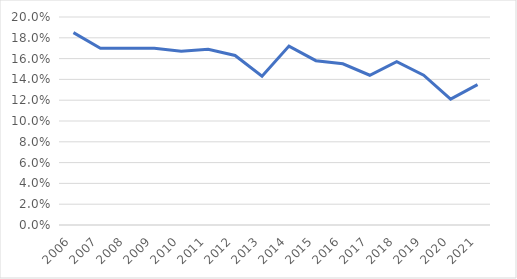
| Category | Series 0 |
|---|---|
| 2006.0 | 0.185 |
| 2007.0 | 0.17 |
| 2008.0 | 0.17 |
| 2009.0 | 0.17 |
| 2010.0 | 0.167 |
| 2011.0 | 0.169 |
| 2012.0 | 0.163 |
| 2013.0 | 0.143 |
| 2014.0 | 0.172 |
| 2015.0 | 0.158 |
| 2016.0 | 0.155 |
| 2017.0 | 0.144 |
| 2018.0 | 0.157 |
| 2019.0 | 0.144 |
| 2020.0 | 0.121 |
| 2021.0 | 0.135 |